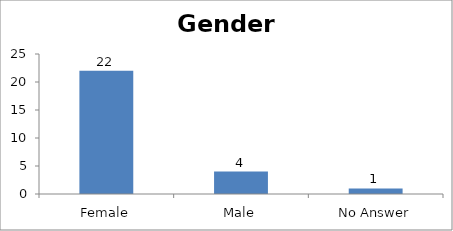
| Category | Gender |
|---|---|
| Female | 22 |
| Male | 4 |
| No Answer | 1 |